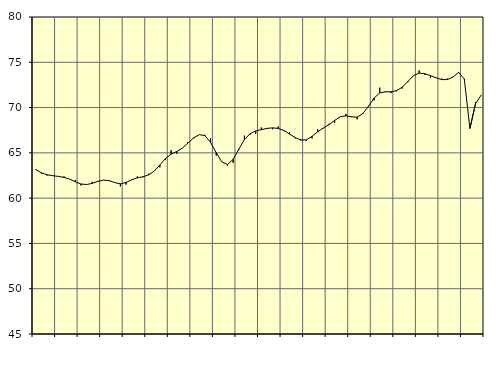
| Category | Piggar | Samtliga anställda (inkl. anställda utomlands) |
|---|---|---|
| nan | 63.2 | 63.14 |
| 1.0 | 62.7 | 62.8 |
| 1.0 | 62.5 | 62.58 |
| 1.0 | 62.5 | 62.48 |
| nan | 62.4 | 62.4 |
| 2.0 | 62.4 | 62.29 |
| 2.0 | 62.1 | 62.1 |
| 2.0 | 62 | 61.81 |
| nan | 61.4 | 61.56 |
| 3.0 | 61.5 | 61.5 |
| 3.0 | 61.8 | 61.63 |
| 3.0 | 61.9 | 61.85 |
| nan | 62 | 61.99 |
| 4.0 | 61.9 | 61.93 |
| 4.0 | 61.7 | 61.72 |
| 4.0 | 61.3 | 61.58 |
| nan | 61.5 | 61.73 |
| 5.0 | 62 | 62.02 |
| 5.0 | 62.4 | 62.24 |
| 5.0 | 62.3 | 62.36 |
| nan | 62.7 | 62.57 |
| 6.0 | 63 | 62.98 |
| 6.0 | 63.4 | 63.66 |
| 6.0 | 64.2 | 64.37 |
| nan | 65.3 | 64.86 |
| 7.0 | 64.9 | 65.15 |
| 7.0 | 65.5 | 65.53 |
| 7.0 | 66.2 | 66.09 |
| nan | 66.6 | 66.66 |
| 8.0 | 67 | 67.01 |
| 8.0 | 67 | 66.9 |
| 8.0 | 66.6 | 66.15 |
| nan | 64.7 | 65.02 |
| 9.0 | 64 | 64 |
| 9.0 | 63.6 | 63.71 |
| 9.0 | 63.9 | 64.28 |
| nan | 65.3 | 65.4 |
| 10.0 | 66.9 | 66.47 |
| 10.0 | 67 | 67.11 |
| 10.0 | 67.1 | 67.42 |
| nan | 67.8 | 67.56 |
| 11.0 | 67.7 | 67.7 |
| 11.0 | 67.6 | 67.76 |
| 11.0 | 67.9 | 67.7 |
| nan | 67.4 | 67.47 |
| 12.0 | 67.3 | 67.08 |
| 12.0 | 66.6 | 66.69 |
| 12.0 | 66.5 | 66.41 |
| nan | 66.3 | 66.44 |
| 13.0 | 66.6 | 66.83 |
| 13.0 | 67.6 | 67.33 |
| 13.0 | 67.7 | 67.74 |
| nan | 68.2 | 68.12 |
| 14.0 | 68.3 | 68.58 |
| 14.0 | 69 | 68.99 |
| 14.0 | 69.3 | 69.09 |
| nan | 69 | 68.97 |
| 15.0 | 68.7 | 68.95 |
| 15.0 | 69.4 | 69.33 |
| 15.0 | 70.2 | 70.12 |
| nan | 70.8 | 71.05 |
| 16.0 | 72.2 | 71.61 |
| 16.0 | 71.7 | 71.75 |
| 16.0 | 71.6 | 71.74 |
| nan | 71.8 | 71.87 |
| 17.0 | 72.1 | 72.25 |
| 17.0 | 72.8 | 72.88 |
| 17.0 | 73.5 | 73.52 |
| nan | 74.1 | 73.81 |
| 18.0 | 73.6 | 73.74 |
| 18.0 | 73.3 | 73.53 |
| 18.0 | 73.3 | 73.29 |
| nan | 73.2 | 73.09 |
| 19.0 | 73.2 | 73.09 |
| 19.0 | 73.4 | 73.37 |
| 19.0 | 73.8 | 73.88 |
| nan | 73.1 | 73.17 |
| 20.0 | 67.7 | 67.69 |
| 20.0 | 70.6 | 70.43 |
| 20.0 | 71.4 | 71.38 |